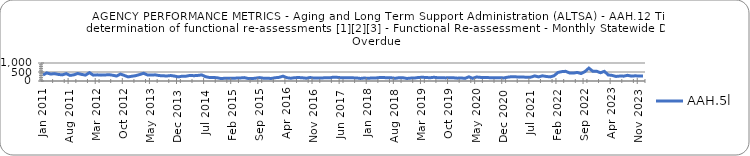
| Category | AAH.5l |
|---|---|
| 2011-01-01 | 334 |
| 2011-02-01 | 449 |
| 2011-03-01 | 385 |
| 2011-04-01 | 409 |
| 2011-05-01 | 364 |
| 2011-06-01 | 340 |
| 2011-07-01 | 408 |
| 2011-08-01 | 311 |
| 2011-09-01 | 344 |
| 2011-10-01 | 418 |
| 2011-11-01 | 366 |
| 2011-12-01 | 327 |
| 2012-01-01 | 463 |
| 2012-02-01 | 325 |
| 2012-03-01 | 342 |
| 2012-04-01 | 326 |
| 2012-05-01 | 333 |
| 2012-06-01 | 353 |
| 2012-07-01 | 321 |
| 2012-08-01 | 276 |
| 2012-09-01 | 385 |
| 2012-10-01 | 311 |
| 2012-11-01 | 229 |
| 2012-12-01 | 264 |
| 2013-01-01 | 299 |
| 2013-02-01 | 360 |
| 2013-03-01 | 430 |
| 2013-04-01 | 336 |
| 2013-05-01 | 336 |
| 2013-06-01 | 341 |
| 2013-07-01 | 302 |
| 2013-08-01 | 289 |
| 2013-09-01 | 279 |
| 2013-10-01 | 303 |
| 2013-11-01 | 273 |
| 2013-12-01 | 229 |
| 2014-01-01 | 268 |
| 2014-02-01 | 269 |
| 2014-03-01 | 310 |
| 2014-04-01 | 295 |
| 2014-05-01 | 309 |
| 2014-06-01 | 339 |
| 2014-07-01 | 240 |
| 2014-08-01 | 194 |
| 2014-09-01 | 199 |
| 2014-10-01 | 179 |
| 2014-11-01 | 136 |
| 2014-12-01 | 152 |
| 2015-01-01 | 156 |
| 2015-02-01 | 147 |
| 2015-03-01 | 163 |
| 2015-04-01 | 169 |
| 2015-05-01 | 188 |
| 2015-06-01 | 139 |
| 2015-07-01 | 134 |
| 2015-08-01 | 160 |
| 2015-09-01 | 189 |
| 2015-10-01 | 152 |
| 2015-11-01 | 150 |
| 2015-12-01 | 142 |
| 2016-01-01 | 182 |
| 2016-02-01 | 203 |
| 2016-03-01 | 268 |
| 2016-04-01 | 182 |
| 2016-05-01 | 153 |
| 2016-06-01 | 182 |
| 2016-07-01 | 194 |
| 2016-08-01 | 178 |
| 2016-09-01 | 154 |
| 2016-10-01 | 193 |
| 2016-11-01 | 161 |
| 2016-12-01 | 165 |
| 2017-01-01 | 170 |
| 2017-02-01 | 178 |
| 2017-03-01 | 174 |
| 2017-04-01 | 213 |
| 2017-05-01 | 203 |
| 2017-06-01 | 180 |
| 2017-07-01 | 183 |
| 2017-08-01 | 180 |
| 2017-09-01 | 175 |
| 2017-10-01 | 170 |
| 2017-11-01 | 142 |
| 2017-12-01 | 166 |
| 2018-01-01 | 148 |
| 2018-02-01 | 171 |
| 2018-03-01 | 169 |
| 2018-04-01 | 194 |
| 2018-05-01 | 190 |
| 2018-06-01 | 182 |
| 2018-07-01 | 177 |
| 2018-08-01 | 149 |
| 2018-09-01 | 187 |
| 2018-10-01 | 181 |
| 2018-11-01 | 140 |
| 2018-12-01 | 161 |
| 2019-01-01 | 166 |
| 2019-02-01 | 196 |
| 2019-03-01 | 206 |
| 2019-04-01 | 195 |
| 2019-05-01 | 179 |
| 2019-06-01 | 209 |
| 2019-07-01 | 179 |
| 2019-08-01 | 186 |
| 2019-09-01 | 172 |
| 2019-10-01 | 187 |
| 2019-11-01 | 179 |
| 2019-12-01 | 158 |
| 2020-01-01 | 170 |
| 2020-02-01 | 145 |
| 2020-03-01 | 232 |
| 2020-04-01 | 147 |
| 2020-05-01 | 221 |
| 2020-06-01 | 201 |
| 2020-07-01 | 191 |
| 2020-08-01 | 189 |
| 2020-09-01 | 177 |
| 2020-10-01 | 179 |
| 2020-11-01 | 183 |
| 2020-12-01 | 170 |
| 2021-01-01 | 211 |
| 2021-02-01 | 239 |
| 2021-03-01 | 235 |
| 2021-04-01 | 215 |
| 2021-05-01 | 219 |
| 2021-06-01 | 209 |
| 2021-07-01 | 214 |
| 2021-08-01 | 283 |
| 2021-09-01 | 228 |
| 2021-10-01 | 288 |
| 2021-11-01 | 252 |
| 2021-12-01 | 228 |
| 2022-01-01 | 290 |
| 2022-02-01 | 472 |
| 2022-03-01 | 521 |
| 2022-04-01 | 538 |
| 2022-05-01 | 448 |
| 2022-06-01 | 439 |
| 2022-07-01 | 475 |
| 2022-08-01 | 415 |
| 2022-09-01 | 526 |
| 2022-10-01 | 715 |
| 2022-11-01 | 543 |
| 2022-12-01 | 543 |
| 2023-01-01 | 459 |
| 2023-02-01 | 537 |
| 2023-03-01 | 336 |
| 2023-04-01 | 311 |
| 2023-05-01 | 253 |
| 2023-06-01 | 274 |
| 2023-07-01 | 270 |
| 2023-08-01 | 315 |
| 2023-09-01 | 271 |
| 2023-10-01 | 289 |
| 2023-11-01 | 274 |
| 2023-12-01 | 271 |